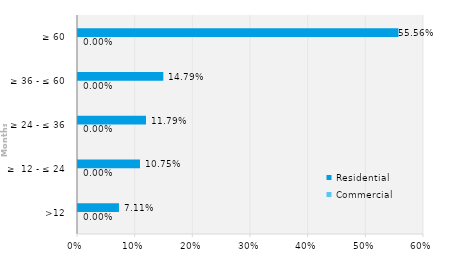
| Category | Commercial | Residential |
|---|---|---|
| >12 | 0 | 0.071 |
| ≥  12 - ≤ 24 | 0 | 0.107 |
| ≥ 24 - ≤ 36 | 0 | 0.118 |
| ≥ 36 - ≤ 60 | 0 | 0.148 |
| ≥ 60 | 0 | 0.556 |